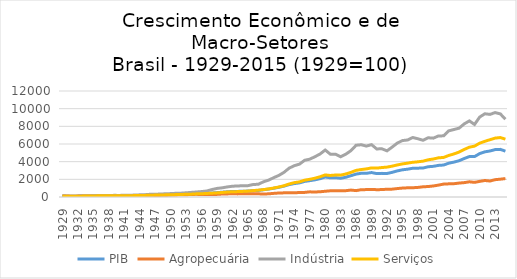
| Category | PIB | Agropecuária | Indústria | Serviços |
|---|---|---|---|---|
| 1929.0 | 100 | 100 | 100 | 100 |
| 1930.0 | 97.876 | 101.2 | 93.3 | 91.4 |
| 1931.0 | 94.689 | 94.824 | 94.42 | 86.83 |
| 1932.0 | 98.786 | 100.514 | 95.741 | 88.046 |
| 1933.0 | 107.587 | 112.576 | 106.943 | 101.429 |
| 1934.0 | 117.451 | 119.555 | 118.814 | 110.76 |
| 1935.0 | 120.941 | 116.566 | 132.953 | 117.295 |
| 1936.0 | 135.508 | 127.64 | 155.821 | 132.66 |
| 1937.0 | 141.73 | 127.768 | 164.235 | 140.222 |
| 1938.0 | 148.103 | 133.134 | 170.312 | 143.027 |
| 1939.0 | 151.745 | 130.072 | 186.151 | 148.748 |
| 1940.0 | 150.228 | 127.731 | 181.125 | 143.244 |
| 1941.0 | 157.663 | 135.778 | 192.717 | 151.982 |
| 1942.0 | 153.414 | 129.803 | 195.415 | 142.255 |
| 1943.0 | 166.464 | 139.279 | 221.796 | 161.459 |
| 1944.0 | 179.059 | 142.622 | 245.528 | 177.282 |
| 1945.0 | 184.826 | 139.484 | 259.032 | 182.424 |
| 1946.0 | 206.222 | 151.201 | 306.953 | 201.031 |
| 1947.0 | 211.229 | 152.259 | 317.082 | 215.505 |
| 1948.0 | 231.718 | 182.555 | 332.97 | 231.634 |
| 1949.0 | 249.561 | 203.265 | 365.688 | 242.079 |
| 1950.0 | 266.531 | 225.702 | 385.328 | 260.628 |
| 1951.0 | 279.591 | 231.587 | 419.548 | 270.3 |
| 1952.0 | 300.001 | 260.941 | 433.403 | 288.745 |
| 1953.0 | 314.101 | 258.436 | 477.472 | 304.11 |
| 1954.0 | 338.601 | 285.202 | 522.098 | 321.967 |
| 1955.0 | 368.398 | 301.49 | 565.688 | 356.232 |
| 1956.0 | 379.081 | 277.802 | 615.965 | 369.35 |
| 1957.0 | 408.271 | 291.057 | 680.093 | 400.912 |
| 1958.0 | 452.364 | 289.187 | 840.058 | 432.044 |
| 1959.0 | 496.696 | 296.245 | 972.535 | 466.903 |
| 1960.0 | 543.385 | 334.447 | 1040.021 | 511.818 |
| 1961.0 | 590.116 | 348.051 | 1142.033 | 562.394 |
| 1962.0 | 629.064 | 381.173 | 1219.599 | 595.35 |
| 1963.0 | 632.838 | 352.07 | 1250.835 | 610.328 |
| 1964.0 | 654.355 | 372.281 | 1272.454 | 634.88 |
| 1965.0 | 670.059 | 372.004 | 1283.012 | 665.727 |
| 1966.0 | 714.953 | 356.582 | 1412.383 | 725.839 |
| 1967.0 | 744.981 | 359.019 | 1441.633 | 774.1 |
| 1968.0 | 817.989 | 339.136 | 1715.553 | 838.134 |
| 1969.0 | 895.698 | 358.697 | 1906.493 | 914.633 |
| 1970.0 | 988.851 | 409.837 | 2187.426 | 1018.298 |
| 1971.0 | 1100.591 | 451.64 | 2445.542 | 1132.347 |
| 1972.0 | 1231.561 | 469.706 | 2792.809 | 1272.758 |
| 1973.0 | 1403.98 | 470.176 | 3267.587 | 1471.309 |
| 1974.0 | 1519.106 | 476.288 | 3545.332 | 1627.267 |
| 1975.0 | 1598.1 | 507.723 | 3719.053 | 1708.631 |
| 1976.0 | 1762.704 | 519.908 | 4154.182 | 1906.832 |
| 1977.0 | 1849.077 | 582.817 | 4282.962 | 2002.174 |
| 1978.0 | 1941.53 | 567.081 | 4557.072 | 2126.308 |
| 1979.0 | 2073.554 | 593.734 | 4866.952 | 2292.16 |
| 1980.0 | 2264.943 | 650.258 | 5317.146 | 2498.913 |
| 1981.0 | 2168.683 | 702.083 | 4847.11 | 2436.94 |
| 1982.0 | 2186.683 | 700.539 | 4845.171 | 2488.36 |
| 1983.0 | 2122.614 | 697.316 | 4558.337 | 2475.171 |
| 1984.0 | 2237.235 | 715.655 | 4845.968 | 2607.593 |
| 1985.0 | 2412.858 | 784.215 | 5246.729 | 2788.56 |
| 1986.0 | 2593.581 | 721.321 | 5858.498 | 3014.433 |
| 1987.0 | 2685.134 | 829.303 | 5916.497 | 3109.087 |
| 1988.0 | 2683.523 | 836.269 | 5762.668 | 3181.528 |
| 1989.0 | 2768.322 | 860.103 | 5927.481 | 3294.154 |
| 1990.0 | 2647.9 | 828.107 | 5442.613 | 3269.119 |
| 1991.0 | 2675.174 | 839.452 | 5456.764 | 3333.194 |
| 1992.0 | 2660.728 | 880.501 | 5226.488 | 3383.858 |
| 1993.0 | 2791.636 | 889.218 | 5647.743 | 3490.788 |
| 1994.0 | 2954.946 | 955.376 | 6102.386 | 3631.118 |
| 1995.0 | 3079.645 | 1010.215 | 6390.419 | 3745.861 |
| 1996.0 | 3147.705 | 1040.016 | 6452.406 | 3832.016 |
| 1997.0 | 3254.412 | 1048.44 | 6734.376 | 3928.966 |
| 1998.0 | 3265.477 | 1084.192 | 6593.628 | 3984.757 |
| 1999.0 | 3280.825 | 1154.99 | 6421.534 | 4057.28 |
| 2000.0 | 3424.853 | 1186.405 | 6704.724 | 4213.485 |
| 2001.0 | 3472.459 | 1248.098 | 6661.814 | 4300.283 |
| 2002.0 | 3578.369 | 1348.196 | 6914.962 | 4434.452 |
| 2003.0 | 3619.162 | 1460.231 | 6921.877 | 4478.353 |
| 2004.0 | 3827.626 | 1489.436 | 7490.164 | 4702.718 |
| 2005.0 | 3950.11 | 1506.117 | 7639.218 | 4874.838 |
| 2006.0 | 4106.534 | 1576.001 | 7792.766 | 5085.918 |
| 2007.0 | 4355.801 | 1627.221 | 8276.697 | 5382.427 |
| 2008.0 | 4577.511 | 1721.112 | 8616.041 | 5641.86 |
| 2009.0 | 4571.561 | 1656.914 | 8211.087 | 5758.647 |
| 2010.0 | 4915.799 | 1767.928 | 9048.618 | 6092.648 |
| 2011.0 | 5110.956 | 1867.639 | 9420.517 | 6303.454 |
| 2012.0 | 5209.087 | 1810.115 | 9352.689 | 6486.254 |
| 2013.0 | 5365.359 | 1961.441 | 9555.642 | 6664.626 |
| 2014.0 | 5392.186 | 2016.165 | 9411.352 | 6730.606 |
| 2015.0 | 5188.901 | 2088.949 | 8815.613 | 6548.879 |